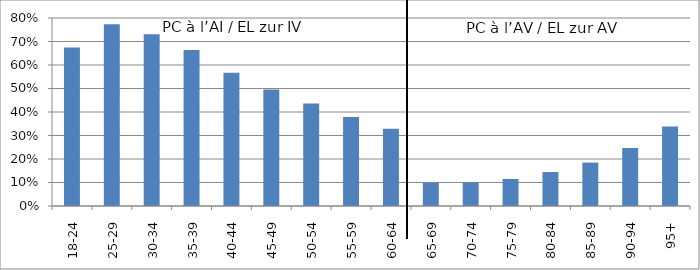
| Category | PC à l’AI / EL zur IV PC à l’AV / EL zur AV |
|---|---|
| 18-24 | 0.675 |
| 25-29 | 0.773 |
| 30-34 | 0.731 |
| 35-39 | 0.664 |
| 40-44 | 0.567 |
| 45-49 | 0.495 |
| 50-54 | 0.437 |
| 55-59 | 0.378 |
| 60-64 | 0.329 |
| 65-69 | 0.099 |
| 70-74 | 0.1 |
| 75-79 | 0.115 |
| 80-84 | 0.145 |
| 85-89 | 0.185 |
| 90-94 | 0.247 |
| 95+ | 0.338 |